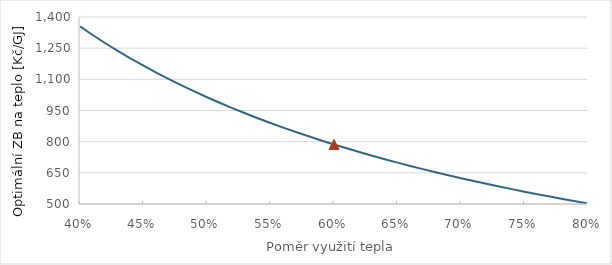
| Category | Series 0 |
|---|---|
| 0.4 | 1354.865 |
| 0.41 | 1313.283 |
| 0.42 | 1273.681 |
| 0.43 | 1235.921 |
| 0.44 | 1199.877 |
| 0.45 | 1165.435 |
| 0.46 | 1132.491 |
| 0.47 | 1100.949 |
| 0.48 | 1070.72 |
| 0.49 | 1041.726 |
| 0.5 | 1013.892 |
| 0.509999999999999 | 987.149 |
| 0.519999999999999 | 961.434 |
| 0.529999999999999 | 936.69 |
| 0.539999999999999 | 912.863 |
| 0.549999999999999 | 889.902 |
| 0.559999999999999 | 867.76 |
| 0.569999999999999 | 846.396 |
| 0.579999999999999 | 825.769 |
| 0.589999999999999 | 805.84 |
| 0.599999999999999 | 786.576 |
| 0.609999999999999 | 767.944 |
| 0.619999999999999 | 749.913 |
| 0.629999999999999 | 732.454 |
| 0.639999999999999 | 715.54 |
| 0.649999999999999 | 699.147 |
| 0.659999999999999 | 683.251 |
| 0.669999999999999 | 667.83 |
| 0.679999999999999 | 652.862 |
| 0.689999999999999 | 638.327 |
| 0.699999999999999 | 624.208 |
| 0.709999999999999 | 610.487 |
| 0.719999999999999 | 597.147 |
| 0.729999999999998 | 584.172 |
| 0.739999999999998 | 571.548 |
| 0.749999999999998 | 559.261 |
| 0.759999999999998 | 547.297 |
| 0.769999999999998 | 535.644 |
| 0.779999999999998 | 524.29 |
| 0.789999999999998 | 513.223 |
| 0.799999999999998 | 502.432 |